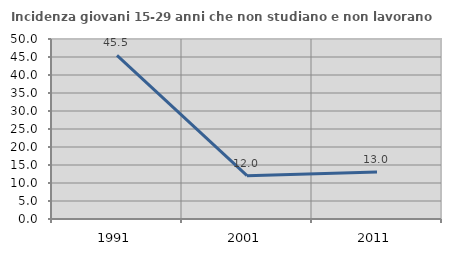
| Category | Incidenza giovani 15-29 anni che non studiano e non lavorano  |
|---|---|
| 1991.0 | 45.455 |
| 2001.0 | 12.048 |
| 2011.0 | 13.043 |